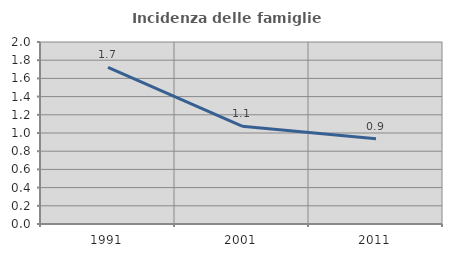
| Category | Incidenza delle famiglie numerose |
|---|---|
| 1991.0 | 1.72 |
| 2001.0 | 1.074 |
| 2011.0 | 0.937 |